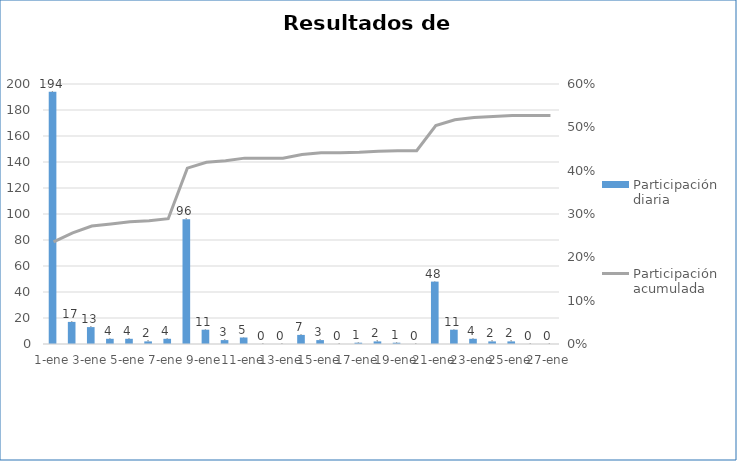
| Category | Participación diaria |
|---|---|
| 0 | 194 |
| 1900-01-01 | 17 |
| 1900-01-02 | 13 |
| 1900-01-03 | 4 |
| 1900-01-04 | 4 |
| 1900-01-05 | 2 |
| 1900-01-06 | 4 |
| 1900-01-07 | 96 |
| 1900-01-08 | 11 |
| 1900-01-09 | 3 |
| 1900-01-10 | 5 |
| 1900-01-11 | 0 |
| 1900-01-12 | 0 |
| 1900-01-13 | 7 |
| 1900-01-14 | 3 |
| 1900-01-15 | 0 |
| 1900-01-16 | 1 |
| 1900-01-17 | 2 |
| 1900-01-18 | 1 |
| 1900-01-19 | 0 |
| 1900-01-20 | 48 |
| 1900-01-21 | 11 |
| 1900-01-22 | 4 |
| 1900-01-23 | 2 |
| 1900-01-24 | 2 |
| 1900-01-25 | 0 |
| 1900-01-26 | 0 |